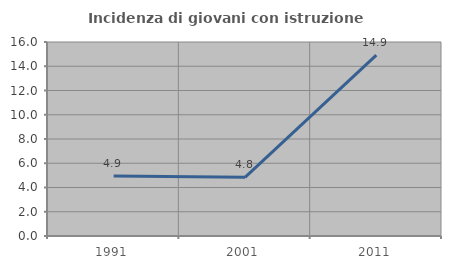
| Category | Incidenza di giovani con istruzione universitaria |
|---|---|
| 1991.0 | 4.945 |
| 2001.0 | 4.839 |
| 2011.0 | 14.925 |